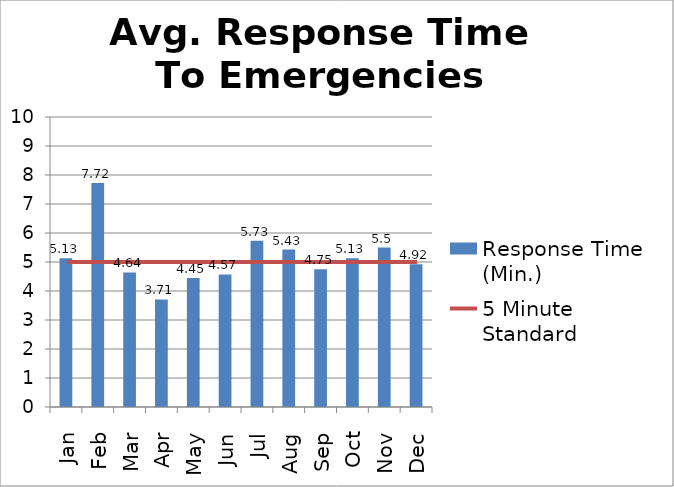
| Category | Response Time (Min.) |
|---|---|
| Jan | 5.13 |
| Feb | 7.72 |
| Mar | 4.64 |
| Apr | 3.71 |
| May | 4.45 |
| Jun | 4.57 |
| Jul | 5.73 |
| Aug | 5.43 |
| Sep | 4.75 |
| Oct | 5.13 |
| Nov | 5.5 |
| Dec | 4.92 |